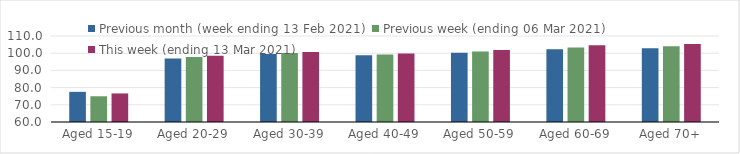
| Category | Previous month (week ending 13 Feb 2021) | Previous week (ending 06 Mar 2021) | This week (ending 13 Mar 2021) |
|---|---|---|---|
| Aged 15-19 | 77.53 | 74.96 | 76.61 |
| Aged 20-29 | 96.86 | 97.78 | 98.57 |
| Aged 30-39 | 99.5 | 100.06 | 100.76 |
| Aged 40-49 | 98.87 | 99.28 | 99.89 |
| Aged 50-59 | 100.33 | 101.04 | 101.85 |
| Aged 60-69 | 102.24 | 103.35 | 104.63 |
| Aged 70+ | 102.88 | 104.05 | 105.38 |